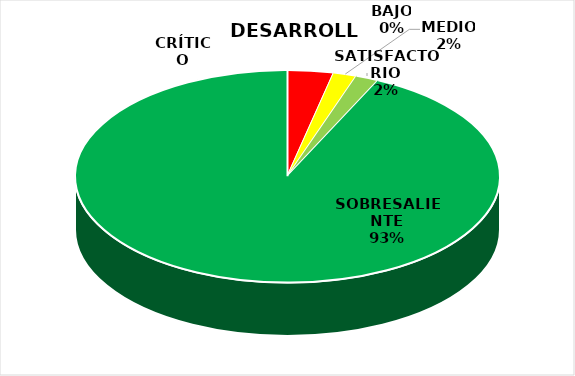
| Category | Series 2 | Series 1 | Series 0 |
|---|---|---|---|
| CRÍTICO | 2 | 0 | 2 |
| BAJO | 0 | 2 | 0 |
| MEDIO | 1 | 4 | 1 |
| SATISFACTORIO | 1 | 6 | 1 |
| SOBRESALIENTE | 53 | 11 | 53 |